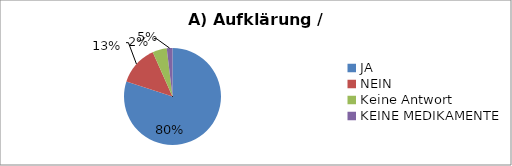
| Category | Series 0 |
|---|---|
| JA | 84 |
| NEIN | 14 |
| Keine Antwort | 5 |
| KEINE MEDIKAMENTE | 2 |